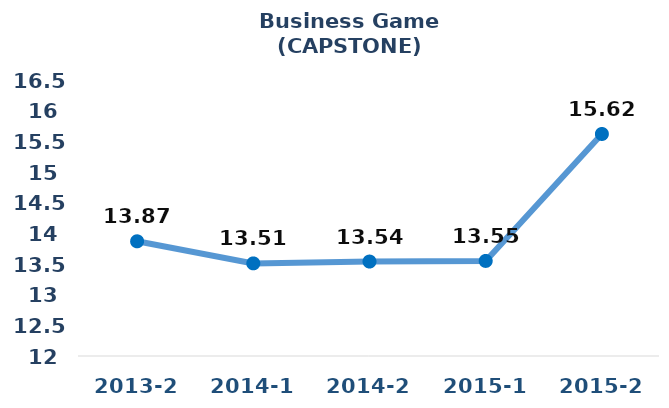
| Category | Series 0 |
|---|---|
| 2013-2 | 13.87 |
| 2014-1 | 13.51 |
| 2014-2 | 13.54 |
| 2015-1 | 13.55 |
| 2015-2 | 15.62 |